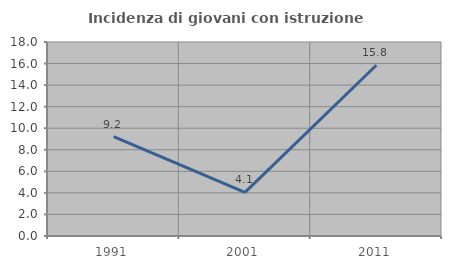
| Category | Incidenza di giovani con istruzione universitaria |
|---|---|
| 1991.0 | 9.231 |
| 2001.0 | 4.054 |
| 2011.0 | 15.842 |